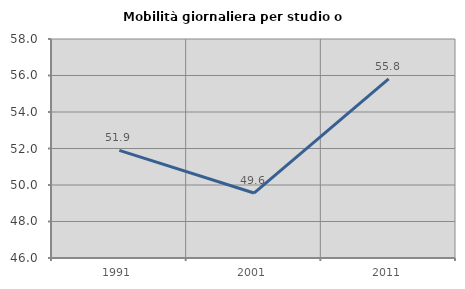
| Category | Mobilità giornaliera per studio o lavoro |
|---|---|
| 1991.0 | 51.894 |
| 2001.0 | 49.56 |
| 2011.0 | 55.81 |